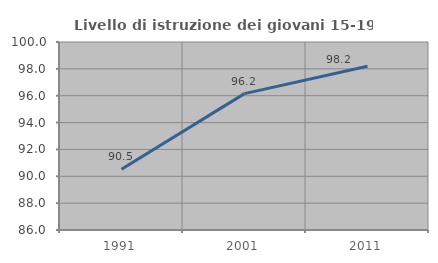
| Category | Livello di istruzione dei giovani 15-19 anni |
|---|---|
| 1991.0 | 90.526 |
| 2001.0 | 96.154 |
| 2011.0 | 98.198 |